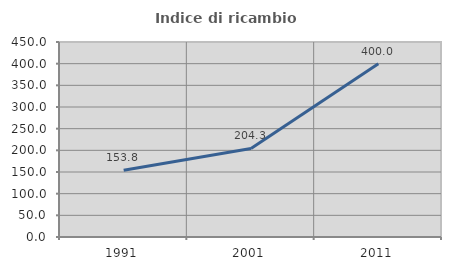
| Category | Indice di ricambio occupazionale  |
|---|---|
| 1991.0 | 153.846 |
| 2001.0 | 204.348 |
| 2011.0 | 400 |